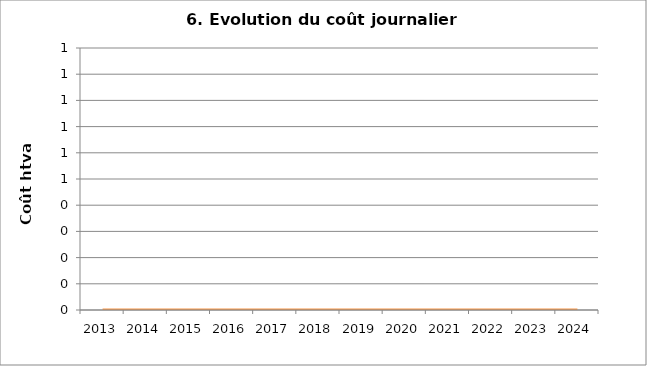
| Category | Coût journalier moyen |
|---|---|
| 2013.0 | 0 |
| 2014.0 | 0 |
| 2015.0 | 0 |
| 2016.0 | 0 |
| 2017.0 | 0 |
| 2018.0 | 0 |
| 2019.0 | 0 |
| 2020.0 | 0 |
| 2021.0 | 0 |
| 2022.0 | 0 |
| 2023.0 | 0 |
| 2024.0 | 0 |